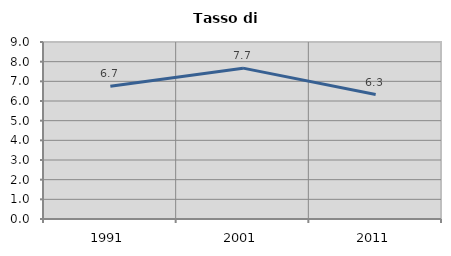
| Category | Tasso di disoccupazione   |
|---|---|
| 1991.0 | 6.748 |
| 2001.0 | 7.67 |
| 2011.0 | 6.326 |